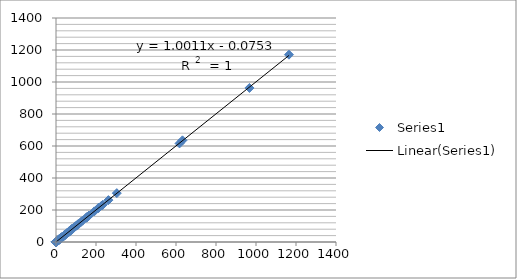
| Category | Series 0 |
|---|---|
| 1164.79896 | 1170.72 |
| 967.203912 | 962.831 |
| 632.2752 | 635.4 |
| 617.71752 | 616.057 |
| 304.0579306 | 305.303 |
| 262.0949108 | 261.746 |
| 234.0080179 | 232.823 |
| 228.6385624652 | 227.765 |
| 214.0327216 | 214.81 |
| 210.4667362 | 210.443 |
| 191.52912553318 | 191.418 |
| 165.51708030162 | 165.764 |
| 163.04124 | 163.12 |
| 156.978754677908 | 156.667 |
| 155.4523658 | 155.604 |
| 155.412075711436 | 154.632 |
| 152.910187566676 | 152.737 |
| 151.576672587804 | 151.299 |
| 132.433397332346 | 133.261 |
| 124.2642 | 124.464 |
| 114.191457100344 | 113.501 |
| 110.99092141908 | 111.113 |
| 109.9104188 | 109.95 |
| 109.50046 | 109.438 |
| 109.348989824392 | 108.77 |
| 107.90384568351 | 107.842 |
| 102.52348633762 | 102.605 |
| 97.18914 | 97.729 |
| 91.90372 | 91.994 |
| 87.99414 | 88.12 |
| 86.7158405 | 86.418 |
| 84.395075966978 | 84.494 |
| 82.93375573588 | 83.691 |
| 81.1487044 | 81.108 |
| 80.76454657028 | 80.948 |
| 80.117809834522 | 80.166 |
| 78.87458 | 78.75 |
| 78.6741104 | 78.187 |
| 78.5070048 | 78.149 |
| 77.65328 | 77.591 |
| 75.124191599688 | 75.148 |
| 71.58686 | 71.578 |
| 70.9372 | 70.869 |
| 70.4977447 | 70.408 |
| 70.020663 | 69.807 |
| 68.828784200176 | 68.949 |
| 68.17556333305 | 68.415 |
| 66.78158 | 66.808 |
| 66.6797183 | 66.35 |
| 65.712984875484 | 65.173 |
| 63.61103980025 | 63.7 |
| 63.46732 | 63.355 |
| 62.625347763884 | 62.85 |
| 61.38743570014 | 61.053 |
| 55.74652 | 55.681 |
| 55.3965 | 55.569 |
| 50.423454101016 | 50.135 |
| 46.994 | 46.854 |
| 45.711315200512 | 45.756 |
| 45.3841356 | 45.355 |
| 44.86826 | 44.79 |
| 43.78734416 | 43.672 |
| 42.619518108844 | 42.529 |
| 41.51252 | 41.464 |
| 41.37926 | 41.25 |
| 39.30256 | 39.386 |
| 39.23715773401 | 39.312 |
| 38.91318 | 38.935 |
| 38.63830573293 | 38.567 |
| 37.786137777678 | 37.858 |
| 32.75825430033 | 32.733 |
| 32.71018346667 | 32.728 |
| 32.4716708138888 | 32.458 |
| 30.120460589108 | 30.002 |
| 28.927328760622 | 28.914 |
| 26.6278201557872 | 26.82 |
| 26.45142056541 | 26.374 |
| 26.309064033002 | 26.35 |
| 25.6734 | 25.728 |
| 25.6561 | 25.579 |
| 24.497582351538 | 24.348 |
| 23.75656 | 23.754 |
| 21.70644 | 21.768 |
| 19.9270360428 | 20.012 |
| 19.758893102792 | 19.749 |
| 19.45059348013 | 19.477 |
| 17.61295129012 | 17.701 |
| 16.957 | 16.977 |
| 16.591028197614 | 16.63 |
| 16.397869261918 | 16.403 |
| 15.844352426134 | 15.873 |
| 15.7004051680214 | 15.865 |
| 15.2449151262292 | 15.325 |
| 15.2203629500254 | 15.156 |
| 15.141686566314 | 15.097 |
| 14.596486342319 | 14.588 |
| 14.48544767235 | 14.521 |
| 14.2907907819294 | 14.209 |
| 14.0418182427198 | 14.067 |
| 13.8903824527066 | 13.974 |
| 13.78178 | 13.776 |
| 12.6640850756228 | 12.742 |
| 12.2973808406808 | 12.161 |
| 12.2476082426298 | 12.159 |
| 11.441643081088 | 11.42 |
| 11.0711661256732 | 11.045 |
| 11.0378068543786 | 10.968 |
| 10.6016140762302 | 10.53 |
| 10.3252970917414 | 10.35 |
| 9.580118574582 | 9.58 |
| 8.542330365907 | 8.791 |
| 6.9833653758024 | 6.946 |
| 6.2688646878918 | 6.25 |
| 6.1926574396338 | 6.25 |
| 5.410028467578 | 5.419 |
| 5.3862920439966 | 5.363 |
| 4.9427469682192 | 4.879 |
| 4.4104396237864 | 4.352 |
| 3.9660583333998 | 3.969 |
| 3.1755117216188 | 3.165 |
| 3.0956276666664 | 3.097 |
| 3.0878053566456 | 3.005 |
| 3.0014704372286 | 2.992 |
| 2.337326273771 | 2.339 |
| 1.4778953268002 | 1.486 |
| 1.4178384036676 | 1.414 |
| 1.1918726999678 | 1.176 |
| 1.1589999048536 | 1.157 |
| 1.1555381493786 | 1.143 |
| 1.1355418931044 | 1.128 |
| 0.9920699999284 | 0.993 |
| 0.9112087880906 | 0.908 |
| 0.8852096352762 | 0.888 |
| 0.7946606666748 | 0.794 |
| 0.7851880000732 | 0.786 |
| 0.4958500338014 | 0.498 |
| 0.4495727467292 | 0.449 |
| 0.4331647665564 | 0.431 |
| 0.3566020000382 | 0.357 |
| 0.3430171013594 | 0.344 |
| 0.2476633525646 | 0.248 |
| 0.158529915331 | 0.158 |
| 0.134543152006 | 0.134 |
| 0.1228913486224 | 0.123 |
| 0.1155407543134 | 0.116 |
| 0.115198219569 | 0.115 |
| 0.0629890589508 | 0.063 |